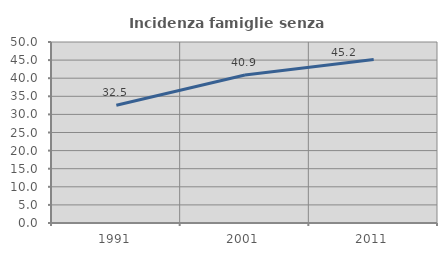
| Category | Incidenza famiglie senza nuclei |
|---|---|
| 1991.0 | 32.541 |
| 2001.0 | 40.876 |
| 2011.0 | 45.152 |